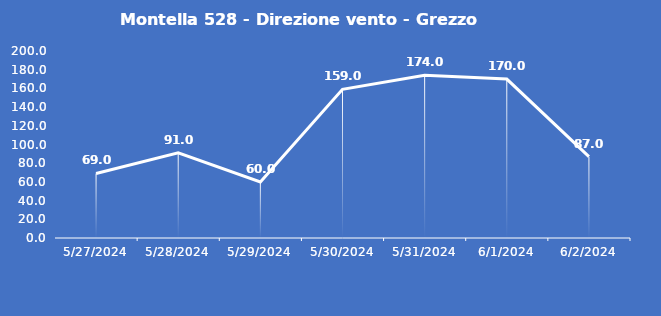
| Category | Montella 528 - Direzione vento - Grezzo (°N) |
|---|---|
| 5/27/24 | 69 |
| 5/28/24 | 91 |
| 5/29/24 | 60 |
| 5/30/24 | 159 |
| 5/31/24 | 174 |
| 6/1/24 | 170 |
| 6/2/24 | 87 |